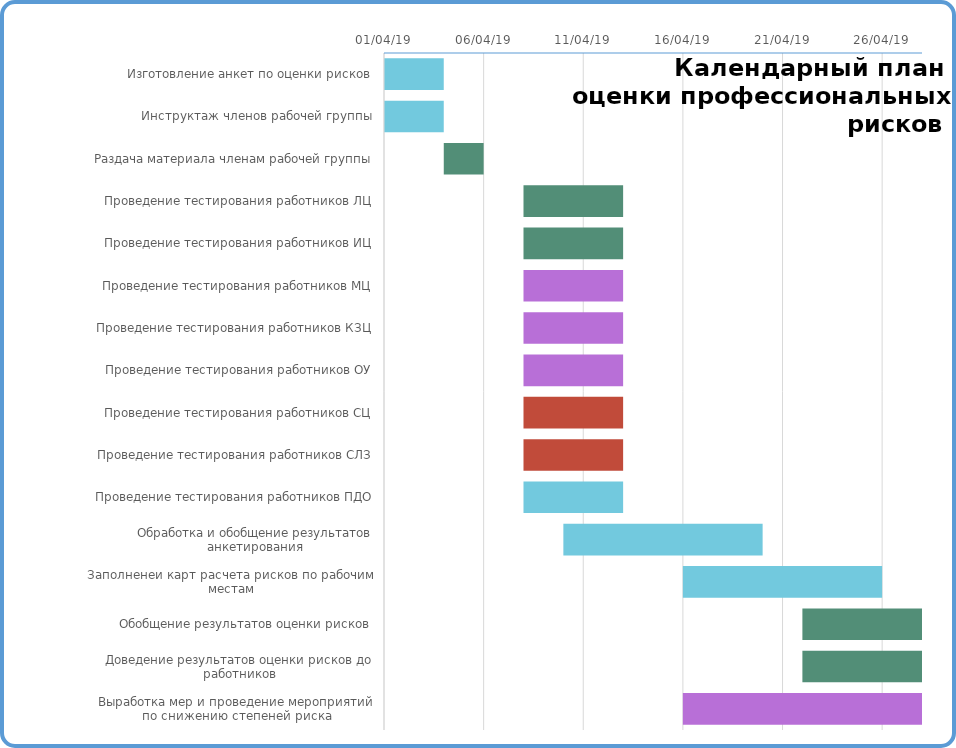
| Category | Start Date | Days Complete | Days Remain |
|---|---|---|---|
| Изготовление анкет по оценки рисков | 4/1/19 | 3 | 0 |
| Инструктаж членов рабочей группы | 4/1/19 | 3 | 0 |
| Раздача материала членам рабочей группы | 4/4/19 | 2 | 0 |
| Проведение тестирования работников ЛЦ | 4/8/19 | 5 | 0 |
| Проведение тестирования работников ИЦ | 4/8/19 | 5 | 0 |
| Проведение тестирования работников МЦ | 4/8/19 | 5 | 0 |
| Проведение тестирования работников КЗЦ | 4/8/19 | 5 | 0 |
| Проведение тестирования работников ОУ | 4/8/19 | 5 | 0 |
| Проведение тестирования работников СЦ | 4/8/19 | 5 | 0 |
| Проведение тестирования работников СЛЗ | 4/8/19 | 5 | 0 |
| Проведение тестирования работников ПДО | 4/8/19 | 5 | 0 |
| Обработка и обобщение результатов анкетирования | 4/10/19 | 10 | 0 |
| Заполненеи карт расчета рисков по рабочим местам | 4/16/19 | 10 | 0 |
| Обобщение результатов оценки рисков | 4/22/19 | 7 | 0 |
| Доведение результатов оценки рисков до работников | 4/22/19 | 7 | 0 |
| Выработка мер и проведение мероприятий по снижению степеней риска | 4/16/19 | 20 | 0 |